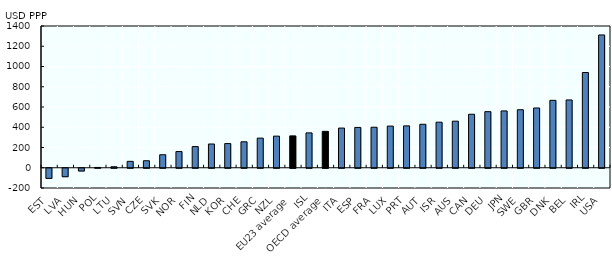
| Category | Per capita tax |
|---|---|
| EST | -100.22 |
| LVA | -83.592 |
| HUN | -27.013 |
| POL | 3.051 |
| LTU | 9.786 |
| SVN | 63.168 |
| CZE | 69.193 |
| SVK | 128.433 |
| NOR | 160.128 |
| FIN | 209.382 |
| NLD | 234.645 |
| KOR | 238.884 |
| CHE | 256.431 |
| GRC | 292.622 |
| NZL | 312.222 |
| EU23 average | 314.677 |
| ISL | 344.436 |
| OECD average | 359.416 |
| ITA | 391.97 |
| ESP | 398.259 |
| FRA | 400.047 |
| LUX | 411.46 |
| PRT | 413.634 |
| AUT | 429.418 |
| ISR | 449.918 |
| AUS | 459.906 |
| CAN | 528.363 |
| DEU | 553.895 |
| JPN | 561.241 |
| SWE | 572.997 |
| GBR | 590.376 |
| DNK | 665.793 |
| BEL | 669.656 |
| IRL | 940.607 |
| USA | 1311.62 |